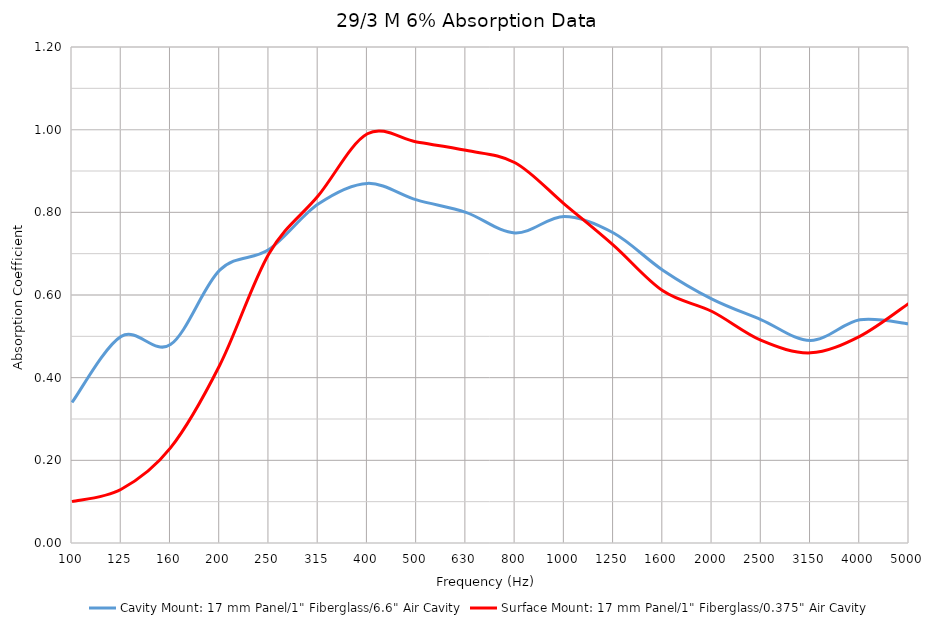
| Category | Cavity Mount: 17 mm Panel/1" Fiberglass/6.6" Air Cavity | Surface Mount: 17 mm Panel/1" Fiberglass/0.375" Air Cavity |
|---|---|---|
| 100.0 | 0.34 | 0.1 |
| 125.0 | 0.5 | 0.13 |
| 160.0 | 0.48 | 0.23 |
| 200.0 | 0.66 | 0.43 |
| 250.0 | 0.71 | 0.7 |
| 315.0 | 0.82 | 0.84 |
| 400.0 | 0.87 | 0.99 |
| 500.0 | 0.83 | 0.97 |
| 630.0 | 0.8 | 0.95 |
| 800.0 | 0.75 | 0.92 |
| 1000.0 | 0.79 | 0.82 |
| 1250.0 | 0.75 | 0.72 |
| 1600.0 | 0.66 | 0.61 |
| 2000.0 | 0.59 | 0.56 |
| 2500.0 | 0.54 | 0.49 |
| 3150.0 | 0.49 | 0.46 |
| 4000.0 | 0.54 | 0.5 |
| 5000.0 | 0.53 | 0.58 |